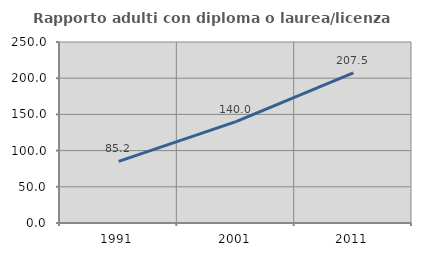
| Category | Rapporto adulti con diploma o laurea/licenza media  |
|---|---|
| 1991.0 | 85.184 |
| 2001.0 | 139.954 |
| 2011.0 | 207.461 |